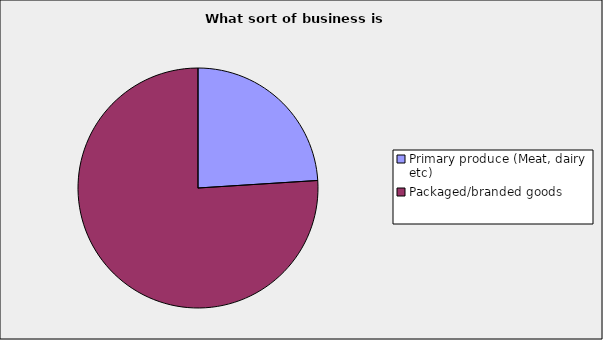
| Category | Series 0 |
|---|---|
| Primary produce (Meat, dairy etc) | 0.24 |
| Packaged/branded goods | 0.76 |